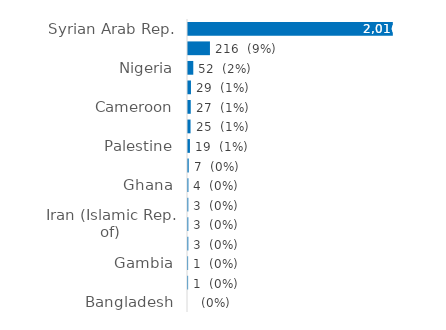
| Category | Series 0 |
|---|---|
| Syrian Arab Rep. | 2016 |
| Others | 216 |
| Nigeria | 52 |
| Lebanon | 29 |
| Cameroon | 27 |
| Dem. Rep. of the Congo | 25 |
| Palestine | 19 |
| Somalia | 7 |
| Ghana | 4 |
| Guinea | 3 |
| Iran (Islamic Rep. of) | 3 |
| Iraq | 3 |
| Gambia | 1 |
| Mali | 1 |
| Bangladesh | 0 |